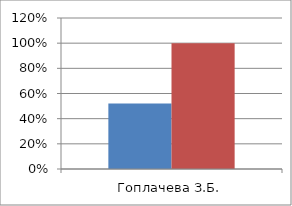
| Category | Series 0 | 2 |
|---|---|---|
| Гоплачева З.Б. | 0.521 | 1 |